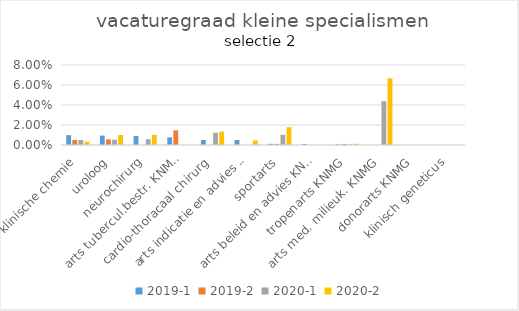
| Category | 2019-1 | 2019-2 | 2020-1 | 2020-2 |
|---|---|---|---|---|
| arts klinische chemie | 0.01 | 0.005 | 0.005 | 0.003 |
| uroloog | 0.009 | 0.006 | 0.005 | 0.01 |
| neurochirurg | 0.009 | 0 | 0.006 | 0.01 |
| arts tubercul.bestr. KNMG | 0.008 | 0.015 | 0 | 0 |
| cardio-thoracaal chirurg | 0.005 | 0 | 0.012 | 0.013 |
| arts indicatie en advies KNMG | 0.005 | 0 | 0 | 0.005 |
| sportarts | 0.001 | 0.001 | 0.01 | 0.018 |
| arts beleid en advies KNMG | 0.001 | 0 | 0 | 0 |
| tropenarts KNMG | 0.001 | 0.001 | 0.001 | 0.001 |
| arts med. milieuk. KNMG | 0 | 0 | 0.044 | 0.067 |
| donorarts KNMG | 0 | 0 | 0 | 0 |
| klinisch geneticus | 0 | 0 | 0 | 0 |